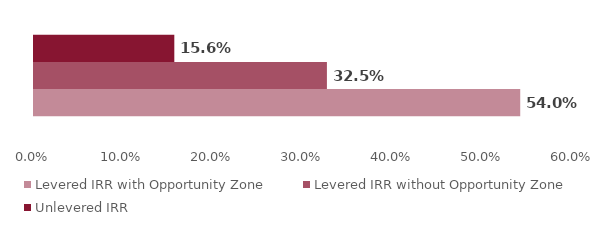
| Category | Levered IRR with Opportunity Zone | Levered IRR without Opportunity Zone | Unlevered IRR |
|---|---|---|---|
| 0 | 0.54 | 0.325 | 0.156 |